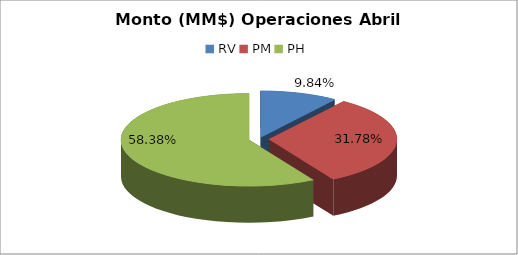
| Category | Series 0 |
|---|---|
| RV | 1231035.305 |
| PM | 3977428.452 |
| PH | 7305106.144 |